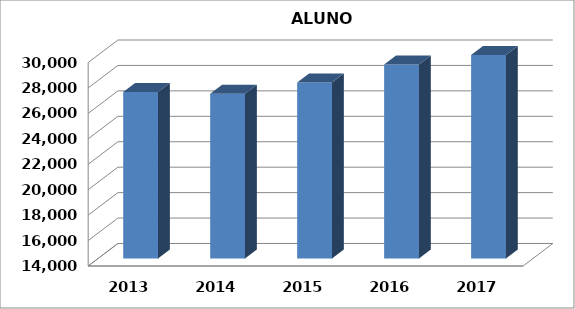
| Category | Series 0 |
|---|---|
| 2013.0 | 27083.371 |
| 2014.0 | 26959.712 |
| 2015.0 | 27845.072 |
| 2016.0 | 29244.98 |
| 2017.0 | 30075.291 |